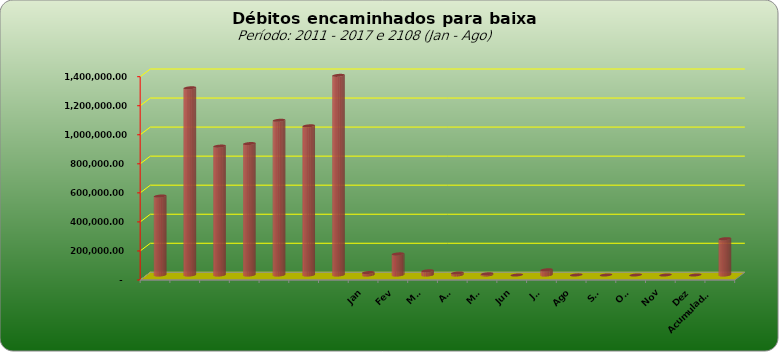
| Category |  543.796,20  |
|---|---|
|  | 543796.2 |
|  | 1289053.69 |
|  | 887573.08 |
|  | 905052.31 |
|  | 1065434.28 |
|  | 1027209.41 |
|  | 1374800.36 |
| Jan | 17005.62 |
| Fev | 145413 |
| Mar | 28943.58 |
| Abr | 13957.8 |
| Mai | 8316.5 |
| Jun | 0 |
| Jul | 35839.29 |
| Ago | 627.19 |
| Set | 0 |
| Out | 0 |
| Nov | 0 |
| Dez | 0 |
| Acumulado
2016 | 250102.98 |